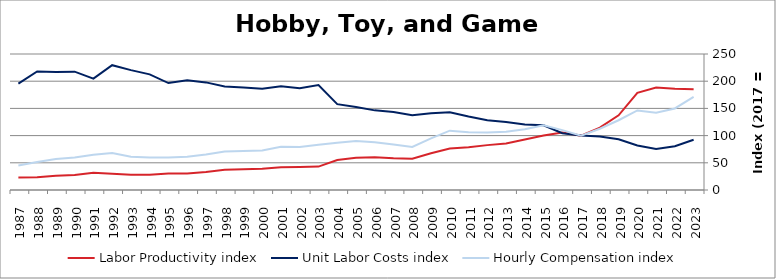
| Category | Labor Productivity index | Unit Labor Costs index | Hourly Compensation index |
|---|---|---|---|
| 2023.0 | 185.139 | 92.412 | 171.09 |
| 2022.0 | 186.106 | 80.526 | 149.863 |
| 2021.0 | 188.492 | 75.405 | 142.133 |
| 2020.0 | 178.51 | 81.916 | 146.228 |
| 2019.0 | 137.326 | 93.398 | 128.26 |
| 2018.0 | 114.615 | 98.267 | 112.628 |
| 2017.0 | 100 | 100 | 100 |
| 2016.0 | 105.502 | 104.291 | 110.03 |
| 2015.0 | 100.012 | 119.054 | 119.069 |
| 2014.0 | 92.794 | 120.308 | 111.639 |
| 2013.0 | 85.664 | 124.917 | 107.009 |
| 2012.0 | 82.497 | 128.21 | 105.77 |
| 2011.0 | 78.507 | 135.011 | 105.992 |
| 2010.0 | 76.323 | 142.958 | 109.109 |
| 2009.0 | 67.42 | 140.92 | 95.009 |
| 2008.0 | 57.57 | 137.378 | 79.089 |
| 2007.0 | 58.378 | 143.191 | 83.593 |
| 2006.0 | 60.106 | 146.39 | 87.989 |
| 2005.0 | 59.103 | 152.485 | 90.123 |
| 2004.0 | 55.108 | 157.815 | 86.968 |
| 2003.0 | 43.03 | 192.924 | 83.015 |
| 2002.0 | 42.298 | 187.19 | 79.177 |
| 2001.0 | 41.688 | 190.604 | 79.459 |
| 2000.0 | 38.946 | 186.207 | 72.521 |
| 1999.0 | 38.17 | 188.217 | 71.843 |
| 1998.0 | 37.126 | 190.459 | 70.71 |
| 1997.0 | 32.917 | 197.809 | 65.113 |
| 1996.0 | 30.243 | 201.766 | 61.02 |
| 1995.0 | 30.356 | 196.626 | 59.688 |
| 1994.0 | 28.133 | 212.61 | 59.814 |
| 1993.0 | 27.813 | 220.357 | 61.288 |
| 1992.0 | 29.729 | 229.428 | 68.206 |
| 1991.0 | 31.713 | 204.774 | 64.94 |
| 1990.0 | 27.443 | 217.519 | 59.695 |
| 1989.0 | 26.362 | 216.811 | 57.156 |
| 1988.0 | 23.636 | 217.966 | 51.518 |
| 1987.0 | 23.006 | 195.392 | 44.953 |